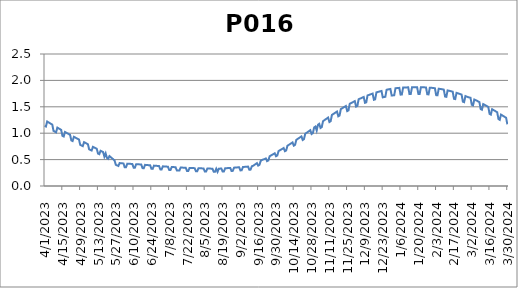
| Category | P016 |
|---|---|
| 4/1/23 | 1.141 |
| 4/2/23 | 1.127 |
| 4/3/23 | 1.221 |
| 4/4/23 | 1.206 |
| 4/5/23 | 1.192 |
| 4/6/23 | 1.177 |
| 4/7/23 | 1.162 |
| 4/8/23 | 1.044 |
| 4/9/23 | 1.03 |
| 4/10/23 | 1.016 |
| 4/11/23 | 1.106 |
| 4/12/23 | 1.092 |
| 4/13/23 | 1.078 |
| 4/14/23 | 1.064 |
| 4/15/23 | 0.951 |
| 4/16/23 | 0.937 |
| 4/17/23 | 1.023 |
| 4/18/23 | 1.01 |
| 4/19/23 | 0.996 |
| 4/20/23 | 0.983 |
| 4/21/23 | 0.97 |
| 4/22/23 | 0.864 |
| 4/23/23 | 0.851 |
| 4/24/23 | 0.932 |
| 4/25/23 | 0.919 |
| 4/26/23 | 0.906 |
| 4/27/23 | 0.893 |
| 4/28/23 | 0.881 |
| 4/29/23 | 0.779 |
| 4/30/23 | 0.767 |
| 5/1/23 | 0.755 |
| 5/2/23 | 0.83 |
| 5/3/23 | 0.818 |
| 5/4/23 | 0.805 |
| 5/5/23 | 0.792 |
| 5/6/23 | 0.696 |
| 5/7/23 | 0.684 |
| 5/8/23 | 0.672 |
| 5/9/23 | 0.742 |
| 5/10/23 | 0.729 |
| 5/11/23 | 0.717 |
| 5/12/23 | 0.705 |
| 5/13/23 | 0.613 |
| 5/14/23 | 0.602 |
| 5/15/23 | 0.668 |
| 5/16/23 | 0.655 |
| 5/17/23 | 0.643 |
| 5/18/23 | 0.555 |
| 5/19/23 | 0.618 |
| 5/20/23 | 0.531 |
| 5/21/23 | 0.515 |
| 5/22/23 | 0.567 |
| 5/23/23 | 0.546 |
| 5/24/23 | 0.526 |
| 5/25/23 | 0.505 |
| 5/26/23 | 0.485 |
| 5/27/23 | 0.401 |
| 5/28/23 | 0.39 |
| 5/29/23 | 0.38 |
| 5/30/23 | 0.435 |
| 5/31/23 | 0.431 |
| 6/1/23 | 0.429 |
| 6/2/23 | 0.428 |
| 6/3/23 | 0.355 |
| 6/4/23 | 0.354 |
| 6/5/23 | 0.423 |
| 6/6/23 | 0.422 |
| 6/7/23 | 0.42 |
| 6/8/23 | 0.419 |
| 6/9/23 | 0.417 |
| 6/10/23 | 0.348 |
| 6/11/23 | 0.346 |
| 6/12/23 | 0.413 |
| 6/13/23 | 0.412 |
| 6/14/23 | 0.41 |
| 6/15/23 | 0.409 |
| 6/16/23 | 0.407 |
| 6/17/23 | 0.339 |
| 6/18/23 | 0.337 |
| 6/19/23 | 0.4 |
| 6/20/23 | 0.398 |
| 6/21/23 | 0.396 |
| 6/22/23 | 0.394 |
| 6/23/23 | 0.392 |
| 6/24/23 | 0.326 |
| 6/25/23 | 0.324 |
| 6/26/23 | 0.386 |
| 6/27/23 | 0.384 |
| 6/28/23 | 0.382 |
| 6/29/23 | 0.38 |
| 6/30/23 | 0.378 |
| 7/1/23 | 0.314 |
| 7/2/23 | 0.313 |
| 7/3/23 | 0.373 |
| 7/4/23 | 0.371 |
| 7/5/23 | 0.369 |
| 7/6/23 | 0.367 |
| 7/7/23 | 0.366 |
| 7/8/23 | 0.303 |
| 7/9/23 | 0.302 |
| 7/10/23 | 0.36 |
| 7/11/23 | 0.359 |
| 7/12/23 | 0.357 |
| 7/13/23 | 0.356 |
| 7/14/23 | 0.295 |
| 7/15/23 | 0.293 |
| 7/16/23 | 0.292 |
| 7/17/23 | 0.35 |
| 7/18/23 | 0.349 |
| 7/19/23 | 0.348 |
| 7/20/23 | 0.346 |
| 7/21/23 | 0.345 |
| 7/22/23 | 0.286 |
| 7/23/23 | 0.285 |
| 7/24/23 | 0.342 |
| 7/25/23 | 0.341 |
| 7/26/23 | 0.34 |
| 7/27/23 | 0.339 |
| 7/28/23 | 0.338 |
| 7/29/23 | 0.279 |
| 7/30/23 | 0.278 |
| 7/31/23 | 0.335 |
| 8/1/23 | 0.335 |
| 8/2/23 | 0.334 |
| 8/3/23 | 0.334 |
| 8/4/23 | 0.333 |
| 8/5/23 | 0.274 |
| 8/6/23 | 0.274 |
| 8/7/23 | 0.331 |
| 8/8/23 | 0.33 |
| 8/9/23 | 0.329 |
| 8/10/23 | 0.329 |
| 8/11/23 | 0.328 |
| 8/12/23 | 0.27 |
| 8/13/23 | 0.269 |
| 8/14/23 | 0.327 |
| 8/15/23 | 0.268 |
| 8/16/23 | 0.328 |
| 8/17/23 | 0.329 |
| 8/18/23 | 0.331 |
| 8/19/23 | 0.274 |
| 8/20/23 | 0.276 |
| 8/21/23 | 0.336 |
| 8/22/23 | 0.337 |
| 8/23/23 | 0.339 |
| 8/24/23 | 0.341 |
| 8/25/23 | 0.342 |
| 8/26/23 | 0.285 |
| 8/27/23 | 0.286 |
| 8/28/23 | 0.348 |
| 8/29/23 | 0.349 |
| 8/30/23 | 0.351 |
| 8/31/23 | 0.353 |
| 9/1/23 | 0.354 |
| 9/2/23 | 0.295 |
| 9/3/23 | 0.297 |
| 9/4/23 | 0.36 |
| 9/5/23 | 0.362 |
| 9/6/23 | 0.364 |
| 9/7/23 | 0.366 |
| 9/8/23 | 0.368 |
| 9/9/23 | 0.308 |
| 9/10/23 | 0.31 |
| 9/11/23 | 0.374 |
| 9/12/23 | 0.383 |
| 9/13/23 | 0.4 |
| 9/14/23 | 0.415 |
| 9/15/23 | 0.432 |
| 9/16/23 | 0.387 |
| 9/17/23 | 0.401 |
| 9/18/23 | 0.478 |
| 9/19/23 | 0.493 |
| 9/20/23 | 0.502 |
| 9/21/23 | 0.51 |
| 9/22/23 | 0.522 |
| 9/23/23 | 0.471 |
| 9/24/23 | 0.485 |
| 9/25/23 | 0.563 |
| 9/26/23 | 0.578 |
| 9/27/23 | 0.591 |
| 9/28/23 | 0.605 |
| 9/29/23 | 0.619 |
| 9/30/23 | 0.564 |
| 10/1/23 | 0.578 |
| 10/2/23 | 0.661 |
| 10/3/23 | 0.676 |
| 10/4/23 | 0.69 |
| 10/5/23 | 0.704 |
| 10/6/23 | 0.719 |
| 10/7/23 | 0.659 |
| 10/8/23 | 0.673 |
| 10/9/23 | 0.762 |
| 10/10/23 | 0.778 |
| 10/11/23 | 0.794 |
| 10/12/23 | 0.809 |
| 10/13/23 | 0.825 |
| 10/14/23 | 0.764 |
| 10/15/23 | 0.779 |
| 10/16/23 | 0.874 |
| 10/17/23 | 0.89 |
| 10/18/23 | 0.907 |
| 10/19/23 | 0.924 |
| 10/20/23 | 0.939 |
| 10/21/23 | 0.872 |
| 10/22/23 | 0.888 |
| 10/23/23 | 0.989 |
| 10/24/23 | 1.006 |
| 10/25/23 | 1.023 |
| 10/26/23 | 1.04 |
| 10/27/23 | 1.057 |
| 10/28/23 | 0.984 |
| 10/29/23 | 1.001 |
| 10/30/23 | 1.108 |
| 10/31/23 | 1.126 |
| 11/1/23 | 1.05 |
| 11/2/23 | 1.16 |
| 11/3/23 | 1.178 |
| 11/4/23 | 1.099 |
| 11/5/23 | 1.116 |
| 11/6/23 | 1.228 |
| 11/7/23 | 1.245 |
| 11/8/23 | 1.263 |
| 11/9/23 | 1.279 |
| 11/10/23 | 1.297 |
| 11/11/23 | 1.212 |
| 11/12/23 | 1.228 |
| 11/13/23 | 1.346 |
| 11/14/23 | 1.362 |
| 11/15/23 | 1.378 |
| 11/16/23 | 1.394 |
| 11/17/23 | 1.41 |
| 11/18/23 | 1.32 |
| 11/19/23 | 1.335 |
| 11/20/23 | 1.457 |
| 11/21/23 | 1.471 |
| 11/22/23 | 1.486 |
| 11/23/23 | 1.501 |
| 11/24/23 | 1.515 |
| 11/25/23 | 1.418 |
| 11/26/23 | 1.431 |
| 11/27/23 | 1.557 |
| 11/28/23 | 1.57 |
| 11/29/23 | 1.582 |
| 11/30/23 | 1.595 |
| 12/1/23 | 1.607 |
| 12/2/23 | 1.504 |
| 12/3/23 | 1.515 |
| 12/4/23 | 1.643 |
| 12/5/23 | 1.654 |
| 12/6/23 | 1.664 |
| 12/7/23 | 1.675 |
| 12/8/23 | 1.686 |
| 12/9/23 | 1.576 |
| 12/10/23 | 1.584 |
| 12/11/23 | 1.715 |
| 12/12/23 | 1.724 |
| 12/13/23 | 1.732 |
| 12/14/23 | 1.741 |
| 12/15/23 | 1.75 |
| 12/16/23 | 1.633 |
| 12/17/23 | 1.641 |
| 12/18/23 | 1.773 |
| 12/19/23 | 1.781 |
| 12/20/23 | 1.786 |
| 12/21/23 | 1.794 |
| 12/22/23 | 1.8 |
| 12/23/23 | 1.68 |
| 12/24/23 | 1.685 |
| 12/25/23 | 1.689 |
| 12/26/23 | 1.823 |
| 12/27/23 | 1.828 |
| 12/28/23 | 1.833 |
| 12/29/23 | 1.838 |
| 12/30/23 | 1.713 |
| 12/31/23 | 1.716 |
| 1/1/24 | 1.719 |
| 1/2/24 | 1.851 |
| 1/3/24 | 1.854 |
| 1/4/24 | 1.857 |
| 1/5/24 | 1.858 |
| 1/6/24 | 1.73 |
| 1/7/24 | 1.733 |
| 1/8/24 | 1.864 |
| 1/9/24 | 1.865 |
| 1/10/24 | 1.867 |
| 1/11/24 | 1.868 |
| 1/12/24 | 1.869 |
| 1/13/24 | 1.74 |
| 1/14/24 | 1.741 |
| 1/15/24 | 1.871 |
| 1/16/24 | 1.872 |
| 1/17/24 | 1.872 |
| 1/18/24 | 1.872 |
| 1/19/24 | 1.872 |
| 1/20/24 | 1.742 |
| 1/21/24 | 1.742 |
| 1/22/24 | 1.871 |
| 1/23/24 | 1.87 |
| 1/24/24 | 1.869 |
| 1/25/24 | 1.868 |
| 1/26/24 | 1.867 |
| 1/27/24 | 1.737 |
| 1/28/24 | 1.735 |
| 1/29/24 | 1.862 |
| 1/30/24 | 1.86 |
| 1/31/24 | 1.858 |
| 2/1/24 | 1.855 |
| 2/2/24 | 1.852 |
| 2/3/24 | 1.72 |
| 2/4/24 | 1.718 |
| 2/5/24 | 1.842 |
| 2/6/24 | 1.839 |
| 2/7/24 | 1.835 |
| 2/8/24 | 1.83 |
| 2/9/24 | 1.826 |
| 2/10/24 | 1.694 |
| 2/11/24 | 1.689 |
| 2/12/24 | 1.81 |
| 2/13/24 | 1.804 |
| 2/14/24 | 1.799 |
| 2/15/24 | 1.793 |
| 2/16/24 | 1.786 |
| 2/17/24 | 1.652 |
| 2/18/24 | 1.645 |
| 2/19/24 | 1.764 |
| 2/20/24 | 1.756 |
| 2/21/24 | 1.749 |
| 2/22/24 | 1.74 |
| 2/23/24 | 1.731 |
| 2/24/24 | 1.597 |
| 2/25/24 | 1.588 |
| 2/26/24 | 1.703 |
| 2/27/24 | 1.693 |
| 2/28/24 | 1.683 |
| 2/29/24 | 1.677 |
| 3/1/24 | 1.671 |
| 3/2/24 | 1.539 |
| 3/3/24 | 1.527 |
| 3/4/24 | 1.639 |
| 3/5/24 | 1.626 |
| 3/6/24 | 1.615 |
| 3/7/24 | 1.602 |
| 3/8/24 | 1.59 |
| 3/9/24 | 1.456 |
| 3/10/24 | 1.444 |
| 3/11/24 | 1.551 |
| 3/12/24 | 1.539 |
| 3/13/24 | 1.525 |
| 3/14/24 | 1.511 |
| 3/15/24 | 1.497 |
| 3/16/24 | 1.366 |
| 3/17/24 | 1.352 |
| 3/18/24 | 1.454 |
| 3/19/24 | 1.44 |
| 3/20/24 | 1.427 |
| 3/21/24 | 1.411 |
| 3/22/24 | 1.397 |
| 3/23/24 | 1.268 |
| 3/24/24 | 1.253 |
| 3/25/24 | 1.352 |
| 3/26/24 | 1.337 |
| 3/27/24 | 1.323 |
| 3/28/24 | 1.308 |
| 3/29/24 | 1.292 |
| 3/30/24 | 1.168 |